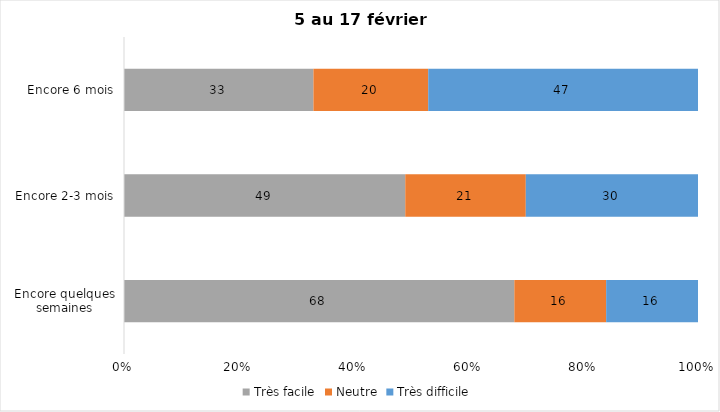
| Category | Très facile | Neutre | Très difficile |
|---|---|---|---|
| Encore quelques semaines | 68 | 16 | 16 |
| Encore 2-3 mois | 49 | 21 | 30 |
| Encore 6 mois | 33 | 20 | 47 |